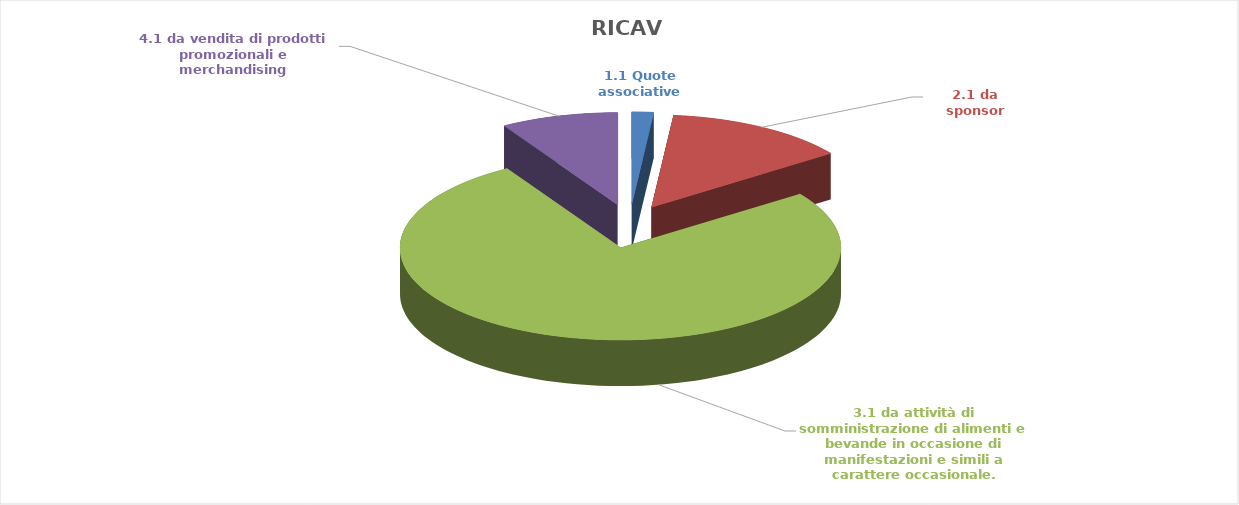
| Category |  RICAVI |
|---|---|
| 1.1 Quote associative | 1200 |
| 2.1 da sponsor | 10200 |
| 3.1 da attività di somministrazione di alimenti e bevande in occasione di manifestazioni e simili a carattere occasionale. | 57699 |
| 4.1 da vendita di prodotti promozionali e merchandising | 6505 |